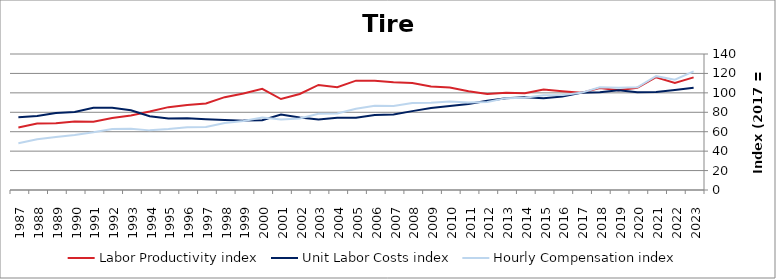
| Category | Labor Productivity index | Unit Labor Costs index | Hourly Compensation index |
|---|---|---|---|
| 2023.0 | 115.918 | 105.355 | 122.125 |
| 2022.0 | 110.276 | 102.934 | 113.512 |
| 2021.0 | 116.086 | 100.942 | 117.179 |
| 2020.0 | 105.157 | 100.564 | 105.75 |
| 2019.0 | 102.583 | 102.579 | 105.228 |
| 2018.0 | 105.064 | 100.679 | 105.778 |
| 2017.0 | 100 | 100 | 100 |
| 2016.0 | 101.675 | 96.14 | 97.75 |
| 2015.0 | 103.357 | 94.371 | 97.538 |
| 2014.0 | 99.558 | 95.482 | 95.06 |
| 2013.0 | 100.054 | 94.515 | 94.565 |
| 2012.0 | 98.812 | 91.78 | 90.689 |
| 2011.0 | 101.657 | 88.497 | 89.964 |
| 2010.0 | 105.46 | 86.452 | 91.172 |
| 2009.0 | 106.562 | 84.368 | 89.904 |
| 2008.0 | 110.194 | 81.185 | 89.461 |
| 2007.0 | 110.982 | 77.836 | 86.384 |
| 2006.0 | 112.392 | 77.177 | 86.741 |
| 2005.0 | 112.576 | 74.303 | 83.648 |
| 2004.0 | 105.797 | 74.42 | 78.734 |
| 2003.0 | 108.116 | 72.49 | 78.373 |
| 2002.0 | 98.807 | 74.566 | 73.677 |
| 2001.0 | 93.628 | 77.603 | 72.658 |
| 2000.0 | 104.151 | 71.734 | 74.711 |
| 1999.0 | 99.369 | 71.416 | 70.965 |
| 1998.0 | 95.563 | 72.11 | 68.911 |
| 1997.0 | 89.026 | 72.854 | 64.859 |
| 1996.0 | 87.506 | 73.96 | 64.719 |
| 1995.0 | 85.299 | 73.656 | 62.828 |
| 1994.0 | 80.79 | 75.978 | 61.382 |
| 1993.0 | 76.788 | 82.059 | 63.012 |
| 1992.0 | 74.108 | 84.669 | 62.747 |
| 1991.0 | 70.318 | 84.542 | 59.448 |
| 1990.0 | 70.618 | 80.322 | 56.722 |
| 1989.0 | 68.766 | 79.366 | 54.577 |
| 1988.0 | 68.404 | 76.229 | 52.144 |
| 1987.0 | 64.364 | 74.838 | 48.169 |